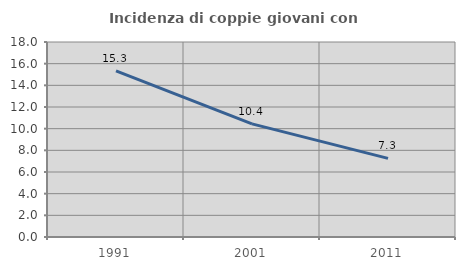
| Category | Incidenza di coppie giovani con figli |
|---|---|
| 1991.0 | 15.341 |
| 2001.0 | 10.44 |
| 2011.0 | 7.26 |